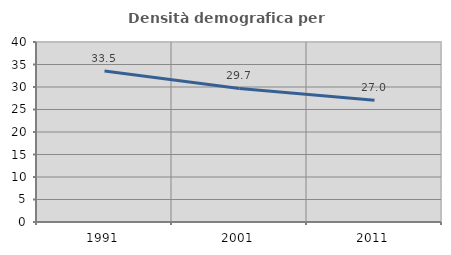
| Category | Densità demografica |
|---|---|
| 1991.0 | 33.537 |
| 2001.0 | 29.682 |
| 2011.0 | 27.038 |